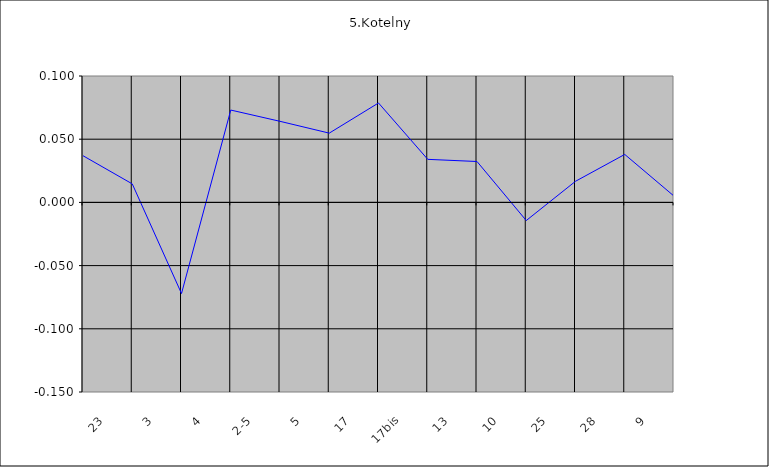
| Category | Kotelny 0.037 |
|---|---|
| 23 | 0.037 |
| 3 | 0.015 |
| 4 | -0.072 |
| 2-5 | 0.073 |
| 5 | 0.064 |
| 17 | 0.055 |
| 17bis | 0.079 |
| 13 | 0.034 |
| 10 | 0.032 |
| 25 | -0.014 |
| 28 | 0.017 |
| 9 | 0.038 |